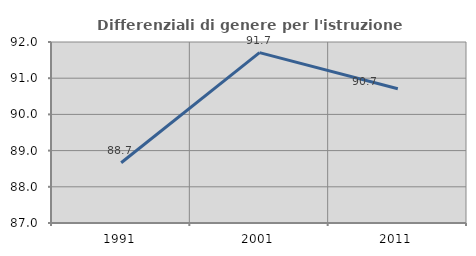
| Category | Differenziali di genere per l'istruzione superiore |
|---|---|
| 1991.0 | 88.665 |
| 2001.0 | 91.706 |
| 2011.0 | 90.707 |